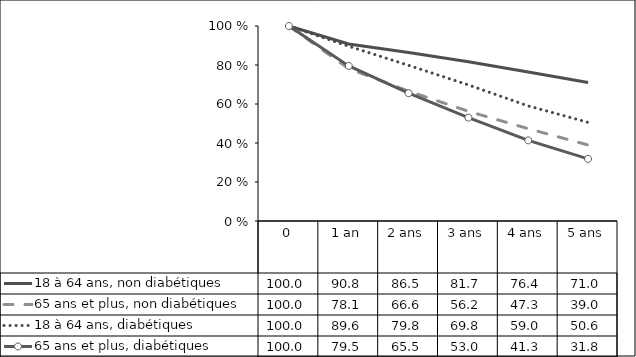
| Category | 18 à 64 ans, non diabétiques | 65 ans et plus, non diabétiques    | 18 à 64 ans, diabétiques | 65 ans et plus, diabétiques |
|---|---|---|---|---|
| 0 | 100 | 100 | 100 | 100 |
| 1 an | 90.773 | 78.146 | 89.611 | 79.535 |
| 2 ans | 86.458 | 66.6 | 79.825 | 65.55 |
| 3 ans | 81.663 | 56.246 | 69.772 | 53.012 |
| 4 ans | 76.429 | 47.334 | 59.019 | 41.342 |
| 5 ans | 71.046 | 38.977 | 50.572 | 31.841 |